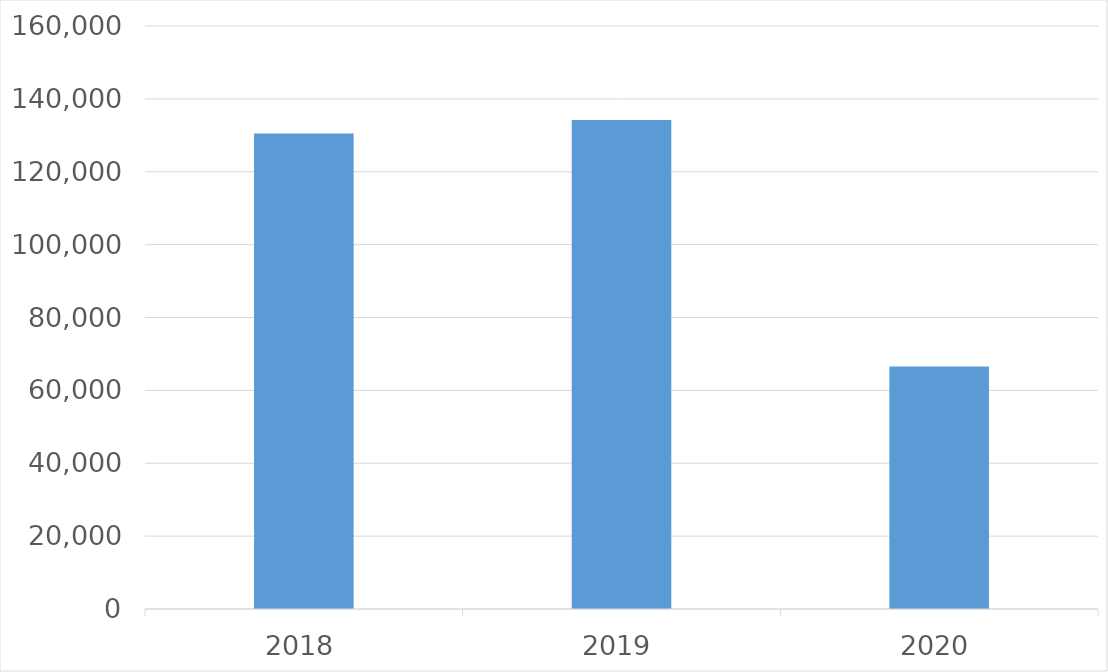
| Category | Series 0 |
|---|---|
| 2018 | 130515 |
| 2019 | 134200 |
| 2020 | 66586 |